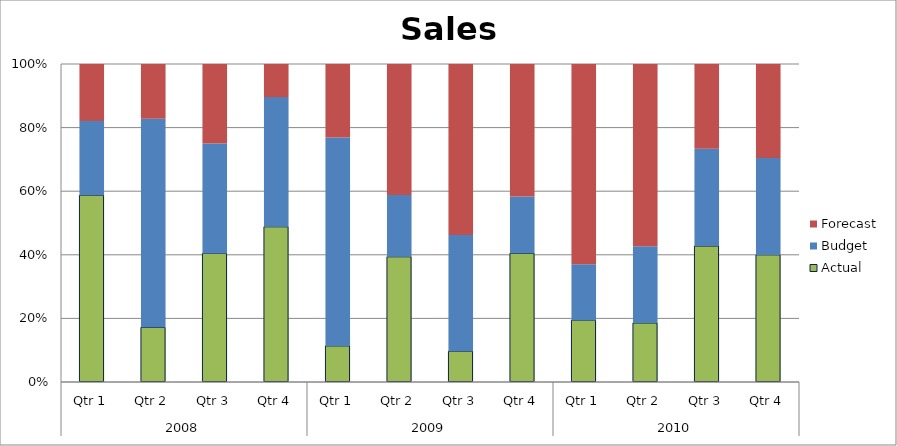
| Category | Actual | Budget | Forecast |
|---|---|---|---|
| 0 | 2390 | 950 | 730 |
| 1 | 770 | 2940 | 770 |
| 2 | 3430 | 2930 | 2120 |
| 3 | 2860 | 2390 | 610 |
| 4 | 560 | 3240 | 1140 |
| 5 | 2370 | 1170 | 2480 |
| 6 | 590 | 2230 | 3280 |
| 7 | 2780 | 1230 | 2860 |
| 8 | 830 | 750 | 2690 |
| 9 | 560 | 730 | 1730 |
| 10 | 2180 | 1560 | 1360 |
| 11 | 2850 | 2170 | 2110 |